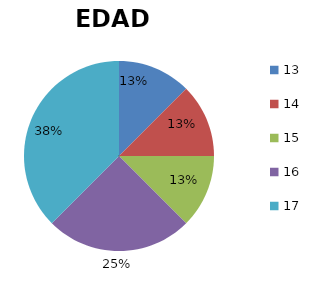
| Category | EDAD |
|---|---|
| 13.0 | 1 |
| 14.0 | 1 |
| 15.0 | 1 |
| 16.0 | 2 |
| 17.0 | 3 |